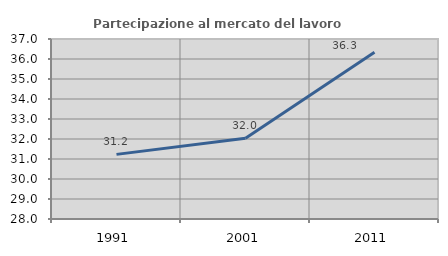
| Category | Partecipazione al mercato del lavoro  femminile |
|---|---|
| 1991.0 | 31.232 |
| 2001.0 | 32.04 |
| 2011.0 | 36.336 |